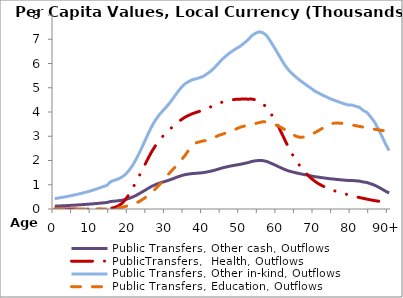
| Category | Public Transfers, Other cash, Outflows | PublicTransfers,  Health, Outflows | Public Transfers, Other in-kind, Outflows | Public Transfers, Education, Outflows |
|---|---|---|---|---|
| 0 | 117.411 | 0 | 428.063 | 0 |
|  | 124.194 | 0 | 452.793 | 0 |
| 2 | 131.369 | 0 | 478.952 | 0 |
| 3 | 138.987 | 0 | 506.724 | 0 |
| 4 | 147.333 | 0 | 537.155 | 0 |
| 5 | 156.301 | 0 | 569.849 | 0 |
| 6 | 165.818 | 0 | 604.548 | 0 |
| 7 | 175.558 | 0 | 640.058 | 0 |
| 8 | 186.155 | 0 | 678.694 | 0 |
| 9 | 197.58 | 0 | 720.349 | 0 |
| 10 | 210.067 | 0 | 765.873 | 0 |
| 11 | 223.059 | 0 | 813.239 | 0 |
| 12 | 238.024 | 0 | 867.801 | 0 |
| 13 | 252.66 | 0 | 921.162 | 0 |
| 14 | 266.61 | 0 | 972.019 | 0 |
| 15 | 309.264 | 29.808 | 1127.531 | 7.474 |
| 16 | 323.861 | 59.566 | 1180.75 | 16.023 |
| 17 | 338.856 | 119.078 | 1235.417 | 34.35 |
| 18 | 359.631 | 223.741 | 1311.162 | 66.028 |
| 19 | 391.387 | 387.902 | 1426.939 | 105.707 |
| 20 | 437.787 | 609.087 | 1596.104 | 148.999 |
| 21 | 497.698 | 872.202 | 1814.531 | 202.661 |
| 22 | 572.659 | 1155.377 | 2087.829 | 255.045 |
| 23 | 656.774 | 1451.507 | 2394.501 | 334.087 |
| 24 | 746.89 | 1753.333 | 2723.051 | 432.323 |
| 25 | 839.342 | 2057.467 | 3060.114 | 549.301 |
| 26 | 928.438 | 2344.47 | 3384.946 | 672.223 |
| 27 | 999.842 | 2591.85 | 3645.275 | 815.505 |
| 28 | 1059.255 | 2806.786 | 3861.887 | 974.624 |
| 29 | 1108.25 | 2987.777 | 4040.515 | 1142.624 |
| 30 | 1153.157 | 3144.006 | 4204.236 | 1339.963 |
| 31 | 1204.324 | 3292.294 | 4390.785 | 1502.197 |
| 32 | 1259.935 | 3432.83 | 4593.535 | 1673.608 |
| 33 | 1320.18 | 3563.895 | 4813.179 | 1818.737 |
| 34 | 1371.824 | 3678.673 | 5001.464 | 2017.047 |
| 35 | 1415.607 | 3780.291 | 5161.092 | 2197.767 |
| 36 | 1440.807 | 3860.749 | 5252.965 | 2421.184 |
| 37 | 1462.18 | 3927.959 | 5330.89 | 2579.832 |
| 38 | 1472.507 | 3982.832 | 5368.542 | 2728.451 |
| 39 | 1485.292 | 4031.015 | 5415.154 | 2771.267 |
| 40 | 1500.922 | 4084.11 | 5472.137 | 2809.304 |
| 41 | 1529.544 | 4147.383 | 5576.489 | 2825.669 |
| 42 | 1560.427 | 4214.016 | 5689.082 | 2894.919 |
| 43 | 1599.33 | 4277.929 | 5830.917 | 2954.746 |
| 44 | 1644.308 | 4345.232 | 5994.899 | 3028.89 |
| 45 | 1690.514 | 4403.205 | 6163.361 | 3078.463 |
| 46 | 1728.018 | 4445.894 | 6300.094 | 3135.857 |
| 47 | 1763.475 | 4483.015 | 6429.365 | 3189.166 |
| 48 | 1791.491 | 4508.625 | 6531.509 | 3245.942 |
| 49 | 1818.541 | 4527.294 | 6630.129 | 3313.993 |
| 50 | 1844.139 | 4530.411 | 6723.455 | 3379.485 |
| 51 | 1878.353 | 4536.17 | 6848.193 | 3417.983 |
| 52 | 1912.892 | 4529.476 | 6974.12 | 3448.229 |
| 53 | 1959.171 | 4534.079 | 7142.846 | 3482.108 |
| 54 | 1987.495 | 4503.424 | 7246.108 | 3524.267 |
| 55 | 2004.371 | 4446.254 | 7307.638 | 3562.189 |
| 56 | 1993.99 | 4340.865 | 7269.788 | 3600.978 |
| 57 | 1962.679 | 4191.904 | 7155.634 | 3590.119 |
| 58 | 1900.042 | 3977.677 | 6927.27 | 3547.507 |
| 59 | 1833.267 | 3730.126 | 6683.818 | 3493.552 |
| 60 | 1761.774 | 3459.042 | 6423.166 | 3438.002 |
| 61 | 1690.073 | 3147.395 | 6161.754 | 3353.797 |
| 62 | 1622.334 | 2823.453 | 5914.788 | 3270.221 |
| 63 | 1566.717 | 2511.74 | 5712.015 | 3181.312 |
| 64 | 1526.2 | 2238.28 | 5564.295 | 3080.077 |
| 65 | 1489.657 | 1985.417 | 5431.067 | 2995.413 |
| 66 | 1454.554 | 1765.731 | 5303.087 | 2956.228 |
| 67 | 1423.682 | 1574.607 | 5190.532 | 2967.429 |
| 68 | 1394.565 | 1414.503 | 5084.374 | 3004.308 |
| 69 | 1364.015 | 1267.363 | 4972.996 | 3054.871 |
| 70 | 1333.282 | 1141.993 | 4860.945 | 3148.866 |
| 71 | 1311.656 | 1041.3 | 4782.101 | 3235.584 |
| 72 | 1290.121 | 957.294 | 4703.589 | 3323.558 |
| 73 | 1269.845 | 883.49 | 4629.664 | 3412.73 |
| 74 | 1249.247 | 820.552 | 4554.568 | 3502.232 |
| 75 | 1233.479 | 765.306 | 4497.082 | 3537.277 |
| 76 | 1218.235 | 715.104 | 4441.501 | 3545.932 |
| 77 | 1202.938 | 668.173 | 4385.731 | 3536.376 |
| 78 | 1189.073 | 625.956 | 4335.18 | 3518.007 |
| 79 | 1176.368 | 587.367 | 4288.862 | 3499.734 |
| 80 | 1176.348 | 547.049 | 4288.789 | 3465.557 |
| 81 | 1162.025 | 508.181 | 4236.57 | 3435.083 |
| 82 | 1150.319 | 473.594 | 4193.89 | 3405.523 |
| 83 | 1114.705 | 440.213 | 4064.047 | 3375.701 |
| 84 | 1093.844 | 407.869 | 3987.992 | 3345.854 |
| 85 | 1042.801 | 376.601 | 3801.897 | 3318.807 |
| 86 | 988.449 | 348.264 | 3603.736 | 3292.286 |
| 87 | 911.985 | 324.176 | 3324.96 | 3266.267 |
| 88 | 828.332 | 306.482 | 3019.973 | 3240.765 |
| 89 | 738.21 | 290.94 | 2691.402 | 3215.561 |
| 90+ | 659.575 | 276.64 | 2404.71 | 3190.554 |